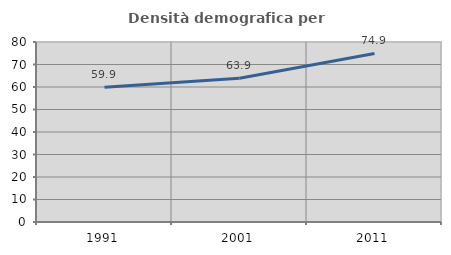
| Category | Densità demografica |
|---|---|
| 1991.0 | 59.924 |
| 2001.0 | 63.871 |
| 2011.0 | 74.906 |